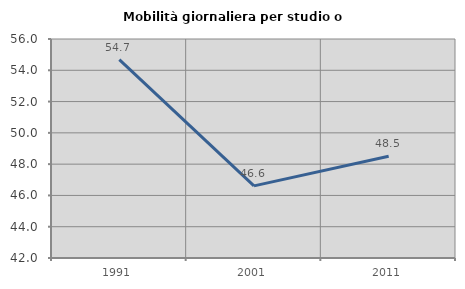
| Category | Mobilità giornaliera per studio o lavoro |
|---|---|
| 1991.0 | 54.678 |
| 2001.0 | 46.611 |
| 2011.0 | 48.509 |